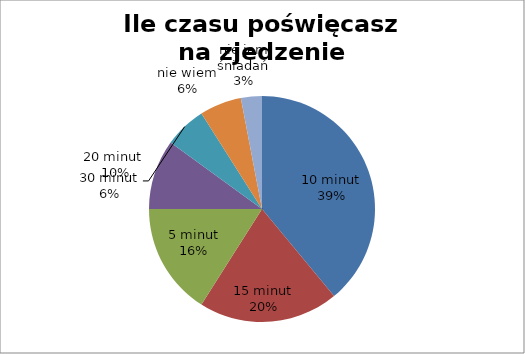
| Category | Ile czasu poświęcasz na zjedzenie śniadania? |
|---|---|
| 10 minut | 39 |
| 15 minut | 20 |
| 5 minut | 16 |
| 20 minut  | 10 |
| 30 minut | 6 |
| nie wiem | 6 |
| nie jem śniadań | 3 |